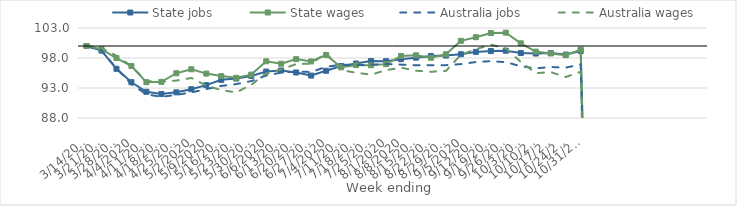
| Category | State jobs | State wages | Australia jobs | Australia wages |
|---|---|---|---|---|
| 14/03/2020 | 100 | 100 | 100 | 100 |
| 21/03/2020 | 99.237 | 99.461 | 99.261 | 99.662 |
| 28/03/2020 | 96.199 | 97.994 | 96.28 | 98.386 |
| 04/04/2020 | 93.963 | 96.66 | 93.636 | 96.64 |
| 11/04/2020 | 92.367 | 93.967 | 91.95 | 94.142 |
| 18/04/2020 | 92.001 | 94.029 | 91.517 | 94.044 |
| 25/04/2020 | 92.275 | 95.458 | 91.861 | 94.24 |
| 02/05/2020 | 92.798 | 96.124 | 92.261 | 94.675 |
| 09/05/2020 | 93.479 | 95.402 | 92.816 | 93.417 |
| 16/05/2020 | 94.357 | 94.987 | 93.349 | 92.645 |
| 23/05/2020 | 94.575 | 94.695 | 93.653 | 92.27 |
| 30/05/2020 | 95.014 | 95.23 | 94.153 | 93.543 |
| 06/06/2020 | 95.741 | 97.45 | 95.073 | 95.449 |
| 13/06/2020 | 95.922 | 97.047 | 95.572 | 96.097 |
| 20/06/2020 | 95.587 | 97.811 | 95.727 | 96.992 |
| 27/06/2020 | 95.072 | 97.424 | 95.674 | 97.05 |
| 04/07/2020 | 95.871 | 98.511 | 96.519 | 98.837 |
| 11/07/2020 | 96.653 | 96.45 | 96.892 | 95.976 |
| 18/07/2020 | 97.084 | 96.808 | 96.803 | 95.549 |
| 25/07/2020 | 97.499 | 96.79 | 96.894 | 95.223 |
| 01/08/2020 | 97.469 | 96.977 | 97.004 | 95.974 |
| 08/08/2020 | 97.81 | 98.331 | 96.893 | 96.39 |
| 15/08/2020 | 98.06 | 98.449 | 96.793 | 95.878 |
| 22/08/2020 | 98.339 | 98.042 | 96.797 | 95.7 |
| 29/08/2020 | 98.41 | 98.625 | 96.807 | 95.852 |
| 05/09/2020 | 98.627 | 100.855 | 96.983 | 98.536 |
| 12/09/2020 | 99.02 | 101.47 | 97.328 | 99.459 |
| 19/09/2020 | 99.154 | 102.154 | 97.472 | 100.228 |
| 26/09/2020 | 99.218 | 102.222 | 97.305 | 99.582 |
| 03/10/2020 | 98.826 | 100.448 | 96.626 | 97.348 |
| 10/10/2020 | 98.743 | 99.064 | 96.269 | 95.474 |
| 17/10/2020 | 98.821 | 98.757 | 96.502 | 95.648 |
| 24/10/2020 | 98.575 | 98.469 | 96.383 | 94.829 |
| 31/10/2020 | 99.17 | 99.398 | 96.953 | 95.711 |